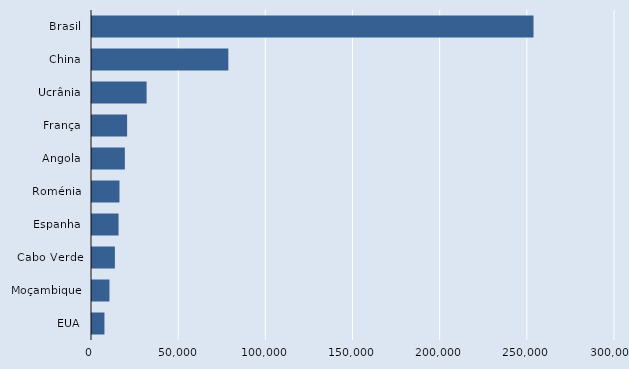
| Category | Series 0 |
|---|---|
| Brasil | 253250 |
| China | 78204 |
| Ucrânia | 31321 |
| França | 20145 |
| Angola | 18847 |
| Roménia | 15764 |
| Espanha | 15237 |
| Cabo Verde | 13130 |
| Moçambique | 10015 |
| EUA | 7139 |